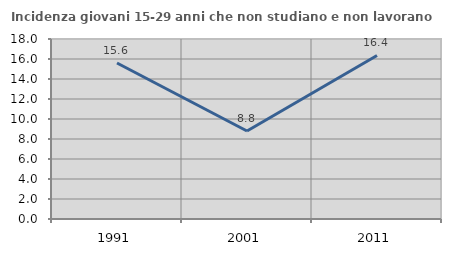
| Category | Incidenza giovani 15-29 anni che non studiano e non lavorano  |
|---|---|
| 1991.0 | 15.597 |
| 2001.0 | 8.803 |
| 2011.0 | 16.352 |